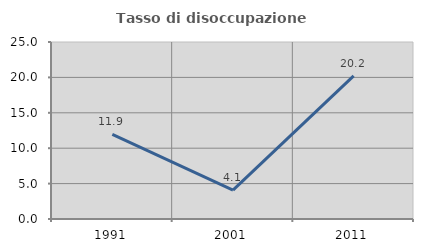
| Category | Tasso di disoccupazione giovanile  |
|---|---|
| 1991.0 | 11.95 |
| 2001.0 | 4.082 |
| 2011.0 | 20.225 |